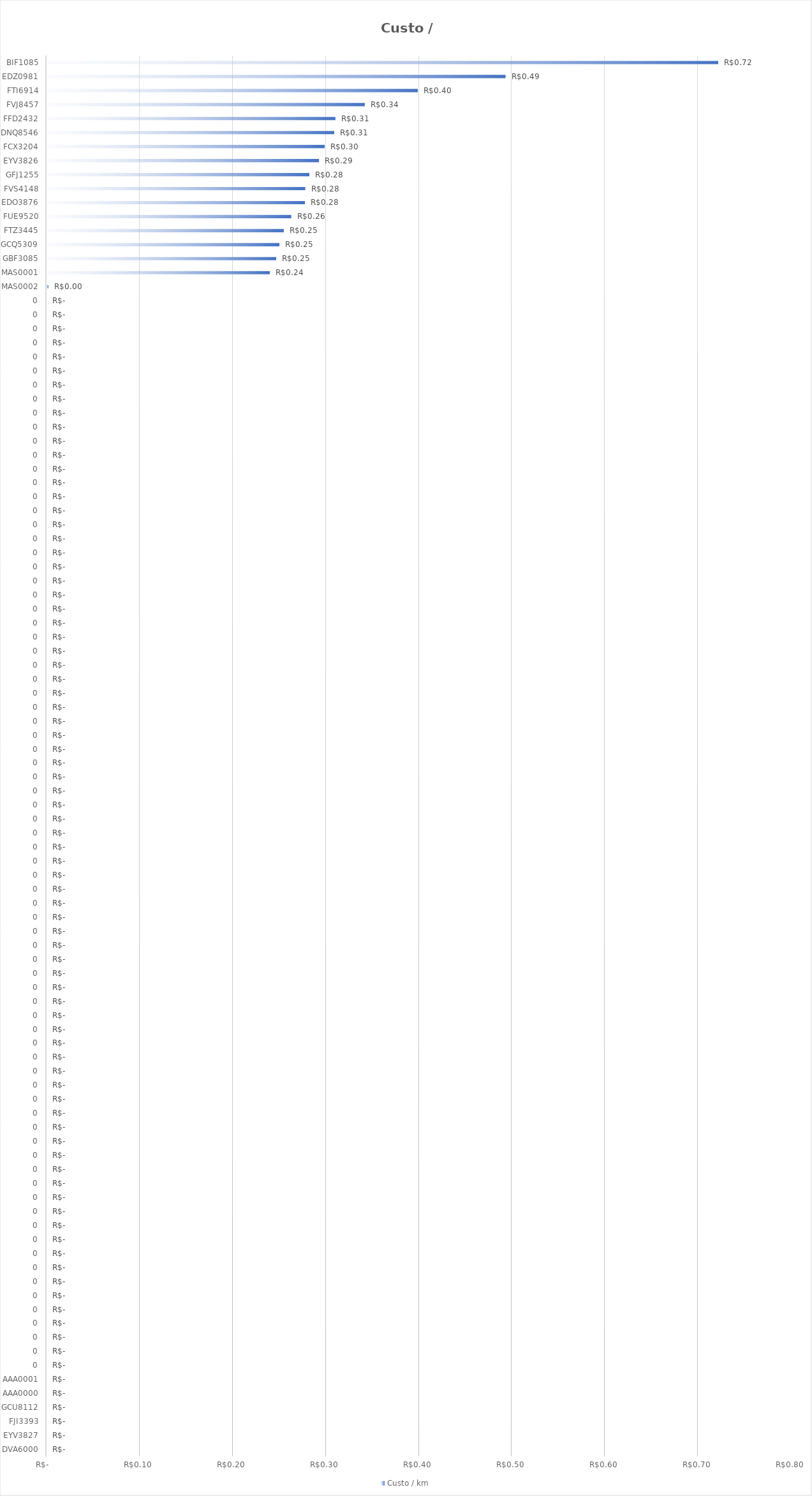
| Category | Custo / km |
|---|---|
| DVA6000 | 0 |
| EYV3827 | 0 |
| FJI3393 | 0 |
| GCU8112 | 0 |
| AAA0000 | 0 |
| AAA0001 | 0 |
| 0 | 0 |
| 0 | 0 |
| 0 | 0 |
| 0 | 0 |
| 0 | 0 |
| 0 | 0 |
| 0 | 0 |
| 0 | 0 |
| 0 | 0 |
| 0 | 0 |
| 0 | 0 |
| 0 | 0 |
| 0 | 0 |
| 0 | 0 |
| 0 | 0 |
| 0 | 0 |
| 0 | 0 |
| 0 | 0 |
| 0 | 0 |
| 0 | 0 |
| 0 | 0 |
| 0 | 0 |
| 0 | 0 |
| 0 | 0 |
| 0 | 0 |
| 0 | 0 |
| 0 | 0 |
| 0 | 0 |
| 0 | 0 |
| 0 | 0 |
| 0 | 0 |
| 0 | 0 |
| 0 | 0 |
| 0 | 0 |
| 0 | 0 |
| 0 | 0 |
| 0 | 0 |
| 0 | 0 |
| 0 | 0 |
| 0 | 0 |
| 0 | 0 |
| 0 | 0 |
| 0 | 0 |
| 0 | 0 |
| 0 | 0 |
| 0 | 0 |
| 0 | 0 |
| 0 | 0 |
| 0 | 0 |
| 0 | 0 |
| 0 | 0 |
| 0 | 0 |
| 0 | 0 |
| 0 | 0 |
| 0 | 0 |
| 0 | 0 |
| 0 | 0 |
| 0 | 0 |
| 0 | 0 |
| 0 | 0 |
| 0 | 0 |
| 0 | 0 |
| 0 | 0 |
| 0 | 0 |
| 0 | 0 |
| 0 | 0 |
| 0 | 0 |
| 0 | 0 |
| 0 | 0 |
| 0 | 0 |
| 0 | 0 |
| 0 | 0 |
| 0 | 0 |
| 0 | 0 |
| 0 | 0 |
| 0 | 0 |
| 0 | 0 |
| MAS0002 | 0.002 |
| MAS0001 | 0.24 |
| GBF3085 | 0.247 |
| GCQ5309 | 0.251 |
| FTZ3445 | 0.255 |
| FUE9520 | 0.263 |
| EDO3876 | 0.278 |
| FVS4148 | 0.278 |
| GFJ1255 | 0.282 |
| EYV3826 | 0.293 |
| FCX3204 | 0.299 |
| DNQ8546 | 0.309 |
| FFD2432 | 0.31 |
| FVJ8457 | 0.342 |
| FTI6914 | 0.399 |
| EDZ0981 | 0.493 |
| BIF1085 | 0.722 |